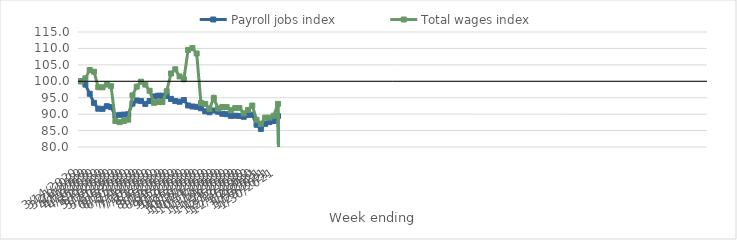
| Category | Payroll jobs index | Total wages index |
|---|---|---|
| 14/03/2020 | 100 | 100 |
| 21/03/2020 | 98.987 | 100.895 |
| 28/03/2020 | 96.208 | 103.445 |
| 04/04/2020 | 93.43 | 102.913 |
| 11/04/2020 | 91.658 | 98.182 |
| 18/04/2020 | 91.61 | 98.165 |
| 25/04/2020 | 92.414 | 99.006 |
| 02/05/2020 | 92.145 | 98.51 |
| 09/05/2020 | 89.578 | 87.899 |
| 16/05/2020 | 89.787 | 87.562 |
| 23/05/2020 | 89.855 | 87.92 |
| 30/05/2020 | 89.954 | 88.326 |
| 06/06/2020 | 93.208 | 95.713 |
| 13/06/2020 | 94.158 | 98.375 |
| 20/06/2020 | 93.977 | 99.883 |
| 27/06/2020 | 93.111 | 98.976 |
| 04/07/2020 | 93.994 | 97.109 |
| 11/07/2020 | 95.387 | 93.454 |
| 18/07/2020 | 95.622 | 93.676 |
| 25/07/2020 | 95.602 | 93.667 |
| 01/08/2020 | 95.471 | 96.985 |
| 08/08/2020 | 94.634 | 102.37 |
| 15/08/2020 | 93.981 | 103.642 |
| 22/08/2020 | 93.778 | 101.479 |
| 29/08/2020 | 94.284 | 100.601 |
| 05/09/2020 | 92.64 | 109.544 |
| 12/09/2020 | 92.329 | 110.114 |
| 19/09/2020 | 92.222 | 108.458 |
| 26/09/2020 | 91.779 | 93.418 |
| 03/10/2020 | 90.858 | 93.106 |
| 10/10/2020 | 90.573 | 91.634 |
| 17/10/2020 | 91.101 | 94.948 |
| 24/10/2020 | 90.723 | 91.688 |
| 31/10/2020 | 90.116 | 92.161 |
| 07/11/2020 | 89.981 | 92.154 |
| 14/11/2020 | 89.489 | 91.186 |
| 21/11/2020 | 89.529 | 91.833 |
| 28/11/2020 | 89.467 | 91.844 |
| 05/12/2020 | 89.202 | 90.24 |
| 12/12/2020 | 89.784 | 91.273 |
| 19/12/2020 | 89.831 | 92.63 |
| 26/12/2020 | 86.781 | 88.277 |
| 02/01/2021 | 85.506 | 87.036 |
| 09/01/2021 | 87.055 | 88.93 |
| 16/01/2021 | 87.585 | 88.932 |
| 23/01/2021 | 87.91 | 89.52 |
| 30/01/2021 | 89.385 | 93.125 |